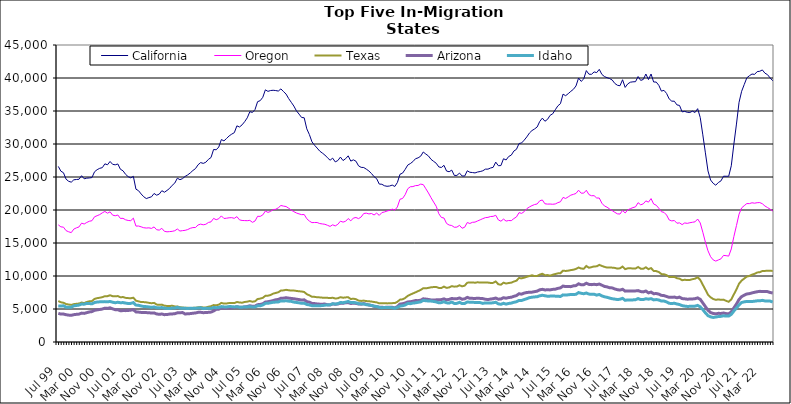
| Category | California | Oregon | Texas | Arizona | Idaho |
|---|---|---|---|---|---|
| Jul 99 | 26605 | 17749 | 6209 | 4339 | 5471 |
| Aug 99 | 25882 | 17447 | 6022 | 4228 | 5444 |
| Sep 99 | 25644 | 17401 | 5941 | 4237 | 5488 |
| Oct 99 | 24669 | 16875 | 5751 | 4134 | 5279 |
| Nov 99 | 24353 | 16701 | 5680 | 4073 | 5260 |
| Dec 99 | 24218 | 16570 | 5619 | 4042 | 5269 |
| Jan 00 | 24574 | 17109 | 5736 | 4142 | 5485 |
| Feb 00 | 24620 | 17295 | 5789 | 4192 | 5530 |
| Mar 00 | 24655 | 17436 | 5826 | 4226 | 5590 |
| Apr 00 | 25195 | 18009 | 5980 | 4375 | 5748 |
| May 00 | 24730 | 17875 | 5897 | 4337 | 5729 |
| Jun 00 | 24825 | 18113 | 6070 | 4444 | 5853 |
| Jul 00 | 24857 | 18294 | 6163 | 4555 | 5824 |
| Aug 00 | 24913 | 18376 | 6199 | 4603 | 5788 |
| Sep 00 | 25792 | 18971 | 6529 | 4804 | 5976 |
| Oct 00 | 26106 | 19135 | 6643 | 4870 | 6058 |
| Nov 00 | 26315 | 19306 | 6705 | 4926 | 6085 |
| Dec 00 | 26415 | 19570 | 6793 | 4991 | 6096 |
| Jan 01 | 26995 | 19781 | 6942 | 5122 | 6119 |
| Feb 01 | 26851 | 19519 | 6948 | 5089 | 6090 |
| Mar 01 | 27352 | 19720 | 7080 | 5180 | 6143 |
| Apr 01 | 26918 | 19221 | 6943 | 5020 | 6020 |
| May 01 | 26848 | 19126 | 6924 | 4899 | 5950 |
| Jun 01 | 26974 | 19241 | 6959 | 4895 | 6019 |
| Jul 01 | 26172 | 18725 | 6778 | 4737 | 5951 |
| Aug 01 | 25943 | 18736 | 6810 | 4757 | 5973 |
| Sep 01 | 25399 | 18514 | 6688 | 4753 | 5895 |
| Oct 01 | 25050 | 18415 | 6650 | 4780 | 5833 |
| Nov 01 | 24873 | 18381 | 6631 | 4826 | 5850 |
| Dec 01 | 25099 | 18765 | 6708 | 4898 | 5969 |
| Jan 02 | 23158 | 17561 | 6261 | 4560 | 5595 |
| Feb 02 | 22926 | 17573 | 6162 | 4531 | 5560 |
| Mar 02 | 22433 | 17452 | 6052 | 4481 | 5458 |
| Apr 02 | 22012 | 17314 | 6046 | 4458 | 5380 |
| May 02 | 21733 | 17267 | 6007 | 4452 | 5358 |
| Jun 02 | 21876 | 17298 | 5933 | 4444 | 5315 |
| Jul 02 | 21997 | 17209 | 5873 | 4383 | 5243 |
| Aug 02 | 22507 | 17436 | 5929 | 4407 | 5315 |
| Sep 02 | 22244 | 17010 | 5672 | 4248 | 5192 |
| Oct 02 | 22406 | 16952 | 5625 | 4191 | 5167 |
| Nov 02 | 22922 | 17223 | 5663 | 4242 | 5221 |
| Dec 02 | 22693 | 16770 | 5499 | 4142 | 5120 |
| Jan 03 | 22964 | 16694 | 5463 | 4166 | 5089 |
| Feb 03 | 23276 | 16727 | 5461 | 4226 | 5077 |
| Mar 03 | 23736 | 16766 | 5486 | 4251 | 5145 |
| Apr 03 | 24079 | 16859 | 5389 | 4289 | 5145 |
| May 03 | 24821 | 17117 | 5378 | 4415 | 5254 |
| Jun 03 | 24592 | 16812 | 5273 | 4426 | 5135 |
| Jul 03 | 24754 | 16875 | 5226 | 4466 | 5124 |
| Aug 03 | 25092 | 16922 | 5181 | 4244 | 5100 |
| Sep 03 | 25316 | 17036 | 5181 | 4279 | 5086 |
| Oct 03 | 25622 | 17228 | 5139 | 4301 | 5110 |
| Nov 03 | 25984 | 17335 | 5175 | 4362 | 5091 |
| Dec 03 | 26269 | 17350 | 5189 | 4396 | 5113 |
| Jan 04 | 26852 | 17734 | 5255 | 4492 | 5152 |
| Feb 04 | 27184 | 17860 | 5301 | 4502 | 5183 |
| Mar 04 | 27062 | 17757 | 5227 | 4443 | 5056 |
| Apr 04 | 27238 | 17840 | 5227 | 4461 | 5104 |
| May 04 | 27671 | 18113 | 5345 | 4493 | 5095 |
| Jun 04 | 27949 | 18201 | 5416 | 4532 | 5103 |
| Jul 04 | 29172 | 18727 | 5597 | 4697 | 5231 |
| Aug 04 | 29122 | 18529 | 5561 | 4945 | 5197 |
| Sep 04 | 29542 | 18678 | 5656 | 4976 | 5237 |
| Oct 04 | 30674 | 19108 | 5922 | 5188 | 5363 |
| Nov 04 | 30472 | 18716 | 5823 | 5106 | 5321 |
| Dec 04 | 30831 | 18755 | 5838 | 5135 | 5312 |
| Jan 05 | 31224 | 18823 | 5906 | 5155 | 5374 |
| Feb 05 | 31495 | 18842 | 5898 | 5168 | 5357 |
| Mar 05 | 31714 | 18738 | 5894 | 5212 | 5313 |
| Apr 05 | 32750 | 18998 | 6060 | 5340 | 5350 |
| May 05 | 32575 | 18504 | 5989 | 5269 | 5276 |
| Jun 05 | 32898 | 18414 | 5954 | 5252 | 5271 |
| Jul 05 | 33384 | 18395 | 6062 | 5322 | 5322 |
| Aug 05 | 33964 | 18381 | 6113 | 5375 | 5316 |
| Sep 05 | 34897 | 18426 | 6206 | 5493 | 5362 |
| Oct 05 | 34780 | 18132 | 6100 | 5408 | 5308 |
| Nov 05 | 35223 | 18332 | 6162 | 5434 | 5314 |
| Dec 05 | 36415 | 19047 | 6508 | 5658 | 5487 |
| Jan 06 | 36567 | 19032 | 6576 | 5688 | 5480 |
| Feb 06 | 37074 | 19257 | 6692 | 5792 | 5616 |
| Mar 06 | 38207 | 19845 | 6993 | 6052 | 5850 |
| Apr 06 | 37976 | 19637 | 7024 | 6101 | 5864 |
| May 06 | 38099 | 19781 | 7114 | 6178 | 5943 |
| Jun 06 | 38141 | 20061 | 7331 | 6276 | 6018 |
| Jul 06 | 38097 | 20111 | 7431 | 6399 | 6046 |
| Aug 06 | 38021 | 20333 | 7542 | 6450 | 6064 |
| Sep 06 | 38349 | 20686 | 7798 | 6627 | 6232 |
| Oct 06 | 37947 | 20591 | 7825 | 6647 | 6216 |
| Nov 06 | 37565 | 20526 | 7907 | 6707 | 6244 |
| Dec 06 | 36884 | 20272 | 7840 | 6648 | 6192 |
| Jan 07 | 36321 | 19984 | 7789 | 6597 | 6151 |
| Feb 07 | 35752 | 19752 | 7799 | 6554 | 6048 |
| Mar 07 | 35025 | 19547 | 7737 | 6487 | 5989 |
| Apr 07 | 34534 | 19412 | 7685 | 6430 | 5937 |
| May 07 | 34022 | 19296 | 7654 | 6353 | 5858 |
| Jun 07 | 33974 | 19318 | 7577 | 6390 | 5886 |
| Jul 07 | 32298 | 18677 | 7250 | 6117 | 5682 |
| Aug 07 | 31436 | 18322 | 7070 | 6034 | 5617 |
| Sep 07 | 30331 | 18087 | 6853 | 5847 | 5500 |
| Oct 07 | 29813 | 18108 | 6839 | 5821 | 5489 |
| Nov 07 | 29384 | 18105 | 6777 | 5769 | 5481 |
| Dec 07 | 28923 | 17949 | 6760 | 5733 | 5499 |
| Jan 08 | 28627 | 17890 | 6721 | 5732 | 5521 |
| Feb 08 | 28328 | 17834 | 6719 | 5749 | 5579 |
| Mar 08 | 27911 | 17680 | 6690 | 5650 | 5614 |
| Apr 08 | 27543 | 17512 | 6656 | 5612 | 5635 |
| May 08 | 27856 | 17754 | 6705 | 5774 | 5798 |
| Jun 08 | 27287 | 17589 | 6593 | 5717 | 5745 |
| Jul 08 | 27495 | 17834 | 6623 | 5761 | 5807 |
| Aug 08 | 28018 | 18309 | 6789 | 5867 | 5982 |
| Sep-08 | 27491 | 18164 | 6708 | 5864 | 5954 |
| Oct 08 | 27771 | 18291 | 6755 | 5942 | 6032 |
| Nov 08 | 28206 | 18706 | 6787 | 5970 | 6150 |
| Dec 08 | 27408 | 18353 | 6505 | 5832 | 5975 |
| Jan 09 | 27601 | 18778 | 6569 | 5890 | 5995 |
| Feb 09 | 27394 | 18863 | 6483 | 5845 | 5936 |
| Mar 09 | 26690 | 18694 | 6273 | 5751 | 5806 |
| Apr 09 | 26461 | 18943 | 6222 | 5735 | 5777 |
| May 09 | 26435 | 19470 | 6272 | 5819 | 5767 |
| Jun 09 | 26187 | 19522 | 6199 | 5700 | 5649 |
| Jul 09 | 25906 | 19408 | 6171 | 5603 | 5617 |
| Aug 09 | 25525 | 19469 | 6128 | 5533 | 5540 |
| Sep 09 | 25050 | 19249 | 6059 | 5405 | 5437 |
| Oct 09 | 24741 | 19529 | 6004 | 5349 | 5369 |
| Nov 09 | 23928 | 19187 | 5854 | 5271 | 5248 |
| Dec 09 | 23899 | 19607 | 5886 | 5261 | 5195 |
| Jan 10 | 23676 | 19703 | 5881 | 5232 | 5234 |
| Feb 10 | 23592 | 19845 | 5850 | 5272 | 5236 |
| Mar 10 | 23634 | 19946 | 5864 | 5278 | 5219 |
| Apr 10 | 23774 | 20134 | 5889 | 5257 | 5201 |
| May 10 | 23567 | 19966 | 5897 | 5172 | 5105 |
| Jun 10 | 24166 | 20464 | 6087 | 5356 | 5237 |
| Jul 10 | 25410 | 21627 | 6417 | 5742 | 5452 |
| Aug 10 | 25586 | 21744 | 6465 | 5797 | 5491 |
| Sep 10 | 26150 | 22314 | 6667 | 5907 | 5609 |
| Oct 10 | 26807 | 23219 | 6986 | 6070 | 5831 |
| Nov 10 | 27033 | 23520 | 7179 | 6100 | 5810 |
| Dec 10 | 27332 | 23551 | 7361 | 6182 | 5898 |
| Jan 11 | 27769 | 23697 | 7525 | 6276 | 5938 |
| Feb 11 | 27898 | 23718 | 7708 | 6267 | 6016 |
| Mar 11 | 28155 | 23921 | 7890 | 6330 | 6081 |
| Apr 11 | 28790 | 23847 | 8146 | 6544 | 6305 |
| May 11 | 28471 | 23215 | 8131 | 6502 | 6248 |
| Jun 11 | 28191 | 22580 | 8199 | 6445 | 6217 |
| Jul 11 | 27678 | 21867 | 8291 | 6368 | 6202 |
| Aug 11 | 27372 | 21203 | 8321 | 6356 | 6146 |
| Sep 11 | 27082 | 20570 | 8341 | 6387 | 6075 |
| Oct 11 | 26528 | 19442 | 8191 | 6402 | 5932 |
| Nov 11 | 26440 | 18872 | 8176 | 6426 | 5968 |
| Dec 11 | 26770 | 18784 | 8401 | 6533 | 6106 |
| Jan 12 | 25901 | 17963 | 8202 | 6390 | 5933 |
| Feb 12 | 25796 | 17718 | 8266 | 6456 | 5900 |
| Mar 12 | 26042 | 17647 | 8456 | 6600 | 6054 |
| Apr 12 | 25239 | 17386 | 8388 | 6534 | 5838 |
| May 12 | 25238 | 17407 | 8401 | 6558 | 5854 |
| Jun 12 | 25593 | 17673 | 8594 | 6669 | 6009 |
| Jul 12 | 25155 | 17237 | 8432 | 6474 | 5817 |
| Aug 12 | 25146 | 17391 | 8536 | 6539 | 5842 |
| Sep 12 | 25942 | 18102 | 8989 | 6759 | 6061 |
| Oct 12 | 25718 | 17953 | 9012 | 6618 | 6027 |
| Nov 12 | 25677 | 18134 | 9032 | 6611 | 6009 |
| Dec 12 | 25619 | 18166 | 8981 | 6601 | 5999 |
| Jan 13 | 25757 | 18344 | 9051 | 6627 | 5989 |
| Feb-13 | 25830 | 18512 | 9001 | 6606 | 5968 |
| Mar-13 | 25940 | 18689 | 9021 | 6577 | 5853 |
| Apr 13 | 26187 | 18844 | 9013 | 6478 | 5925 |
| May 13 | 26192 | 18884 | 9003 | 6431 | 5924 |
| Jun-13 | 26362 | 19013 | 8948 | 6508 | 5896 |
| Jul 13 | 26467 | 19037 | 8958 | 6559 | 5948 |
| Aug 13 | 27253 | 19198 | 9174 | 6655 | 6020 |
| Sep 13 | 26711 | 18501 | 8747 | 6489 | 5775 |
| Oct 13 | 26733 | 18301 | 8681 | 6511 | 5711 |
| Nov 13 | 27767 | 18620 | 8989 | 6709 | 5860 |
| Dec 13 | 27583 | 18320 | 8863 | 6637 | 5740 |
| Jan 14 | 28107 | 18409 | 8939 | 6735 | 5843 |
| Feb-14 | 28313 | 18383 | 8989 | 6779 | 5893 |
| Mar 14 | 28934 | 18696 | 9160 | 6918 | 6015 |
| Apr 14 | 29192 | 18946 | 9291 | 7036 | 6099 |
| May 14 | 30069 | 19603 | 9701 | 7314 | 6304 |
| Jun 14 | 30163 | 19487 | 9641 | 7252 | 6293 |
| Jul-14 | 30587 | 19754 | 9752 | 7415 | 6427 |
| Aug-14 | 31074 | 20201 | 9882 | 7499 | 6557 |
| Sep 14 | 31656 | 20459 | 9997 | 7536 | 6719 |
| Oct 14 | 32037 | 20663 | 10109 | 7555 | 6786 |
| Nov 14 | 32278 | 20825 | 9992 | 7628 | 6831 |
| Dec 14 | 32578 | 20918 | 10006 | 7705 | 6860 |
| Jan 15 | 33414 | 21396 | 10213 | 7906 | 7000 |
| Feb 15 | 33922 | 21518 | 10337 | 7982 | 7083 |
| Mar 15 | 33447 | 20942 | 10122 | 7891 | 7006 |
| Apr-15 | 33731 | 20893 | 10138 | 7906 | 6931 |
| May 15 | 34343 | 20902 | 10053 | 7895 | 6952 |
| Jun-15 | 34572 | 20870 | 10192 | 7973 | 6966 |
| Jul 15 | 35185 | 20916 | 10303 | 8000 | 6949 |
| Aug 15 | 35780 | 21115 | 10399 | 8126 | 6938 |
| Sep 15 | 36109 | 21246 | 10428 | 8207 | 6896 |
| Oct 15 | 37555 | 21908 | 10813 | 8477 | 7140 |
| Nov 15 | 37319 | 21750 | 10763 | 8390 | 7112 |
| Dec 15 | 37624 | 21990 | 10807 | 8395 | 7149 |
| Jan 16 | 37978 | 22248 | 10892 | 8388 | 7201 |
| Feb 16 | 38285 | 22369 | 10951 | 8508 | 7192 |
| Mar 16 | 38792 | 22506 | 11075 | 8547 | 7226 |
| Apr 16 | 39994 | 22999 | 11286 | 8815 | 7487 |
| May 16 | 39488 | 22548 | 11132 | 8673 | 7382 |
| Jun 16 | 39864 | 22556 | 11100 | 8682 | 7315 |
| Jul 16 | 41123 | 22989 | 11516 | 8903 | 7420 |
| Aug 16 | 40573 | 22333 | 11251 | 8731 | 7261 |
| Sep 16 | 40560 | 22162 | 11340 | 8692 | 7216 |
| Oct 16 | 40923 | 22172 | 11456 | 8742 | 7233 |
| Nov 16 | 40817 | 21818 | 11459 | 8685 | 7101 |
| Dec 16 | 41311 | 21815 | 11681 | 8783 | 7203 |
| Jan 17 | 40543 | 21029 | 11524 | 8609 | 6982 |
| Feb 17 | 40218 | 20613 | 11385 | 8416 | 6852 |
| Mar 17 | 40052 | 20425 | 11276 | 8354 | 6775 |
| Apr 17 | 39913 | 20147 | 11297 | 8218 | 6653 |
| May 17 | 39695 | 19910 | 11265 | 8196 | 6552 |
| Jun 17 | 39177 | 19650 | 11225 | 8034 | 6500 |
| Jul 17 | 38901 | 19419 | 11115 | 7923 | 6429 |
| Aug 17 | 38827 | 19389 | 11168 | 7867 | 6479 |
| Sep 17 | 39736 | 19936 | 11426 | 7991 | 6609 |
| Oct 17 | 38576 | 19547 | 11041 | 7708 | 6315 |
| Nov 17 | 39108 | 20013 | 11158 | 7746 | 6381 |
| Dec 17 | 39359 | 20202 | 11185 | 7743 | 6366 |
| Jan 18 | 39420 | 20362 | 11118 | 7736 | 6380 |
| Feb 18 | 39440 | 20476 | 11128 | 7741 | 6407 |
| Mar 18 | 40218 | 21106 | 11362 | 7789 | 6578 |
| Apr 18 | 39637 | 20788 | 11111 | 7642 | 6423 |
| May 18 | 39777 | 20933 | 11097 | 7591 | 6430 |
| Jun 18 | 40602 | 21381 | 11317 | 7721 | 6554 |
| Jul 18 | 39767 | 21189 | 11038 | 7445 | 6489 |
| Aug 18 | 40608 | 21729 | 11200 | 7560 | 6569 |
| Sep 18 | 39395 | 20916 | 10772 | 7318 | 6383 |
| Oct 18 | 39383 | 20724 | 10740 | 7344 | 6429 |
| Nov 18 | 38891 | 20265 | 10605 | 7255 | 6365 |
| Dec 18 | 38013 | 19741 | 10292 | 7069 | 6205 |
| Jan 19 | 38130 | 19643 | 10261 | 7032 | 6203 |
| Feb 19 | 37658 | 19237 | 10132 | 6892 | 6073 |
| Mar 19 | 36831 | 18492 | 9848 | 6766 | 5863 |
| Apr 19 | 36492 | 18349 | 9839 | 6763 | 5827 |
| May 19 | 36481 | 18407 | 9867 | 6809 | 5873 |
| Jun 19 | 35925 | 17998 | 9661 | 6698 | 5761 |
| Jul 19 | 35843 | 18049 | 9598 | 6800 | 5673 |
| Aug 19 | 34870 | 17785 | 9361 | 6577 | 5512 |
| Sep 19 | 34945 | 18038 | 9428 | 6547 | 5437 |
| Oct 19 | 34802 | 17977 | 9385 | 6483 | 5390 |
| Nov 19 | 34775 | 18072 | 9403 | 6511 | 5401 |
| Dec 19 | 34976 | 18140 | 9518 | 6521 | 5419 |
| Jan 20 | 34774 | 18209 | 9594 | 6561 | 5434 |
| Feb 20 | 35352 | 18632 | 9804 | 6682 | 5543 |
| Mar 20 | 34013 | 18041 | 9411 | 6464 | 5330 |
| Apr 20 | 31385 | 16629 | 8666 | 5922 | 4906 |
| May 20 | 28657 | 15123 | 7927 | 5355 | 4419 |
| Jun 20 | 25915 | 13817 | 7164 | 4815 | 3992 |
| Jul 20 | 24545 | 12926 | 6776 | 4457 | 3810 |
| Aug 20 | 24048 | 12443 | 6521 | 4326 | 3720 |
| Sep 20 | 23756 | 12258 | 6386 | 4266 | 3784 |
| Oct 20 | 24166 | 12429 | 6452 | 4347 | 3861 |
| Nov 20 | 24404 | 12597 | 6386 | 4324 | 3883 |
| Dec 20 | 25120 | 13122 | 6420 | 4394 | 3974 |
| Jan 21 | 25111 | 13080 | 6236 | 4304 | 3924 |
| Feb 21 | 25114 | 13015 | 6094 | 4260 | 3930 |
| Mar 21 | 26701 | 14096 | 6455 | 4567 | 4185 |
| Apr 21 | 29998 | 15978 | 7222 | 5164 | 4697 |
| May 21 | 33020 | 17641 | 7969 | 5748 | 5148 |
| Jun 21 | 36320 | 19369 | 8840 | 6450 | 5628 |
| Jul 21 | 37989 | 20320 | 9306 | 6877 | 5984 |
| Aug 21 | 39007 | 20657 | 9615 | 7094 | 6084 |
| Sep 21 | 40023 | 20974 | 9914 | 7277 | 6151 |
| Oct 21 | 40348 | 20966 | 10003 | 7327 | 6140 |
| Nov 21 | 40599 | 21096 | 10203 | 7437 | 6136 |
| Dec 21 | 40548 | 21032 | 10328 | 7532 | 6183 |
| Jan 22 | 40967 | 21106 | 10535 | 7618 | 6237 |
| Feb 22 | 41019 | 21125 | 10579 | 7673 | 6236 |
| Mar 22 | 41220 | 20949 | 10751 | 7660 | 6310 |
| Apr 22 | 40730 | 20602 | 10772 | 7661 | 6221 |
| May 22 | 40504 | 20370 | 10792 | 7636 | 6210 |
| Jun 22 | 40013 | 20127 | 10802 | 7504 | 6199 |
| Jul 22 | 39582 | 19846 | 10761 | 7419 | 6050 |